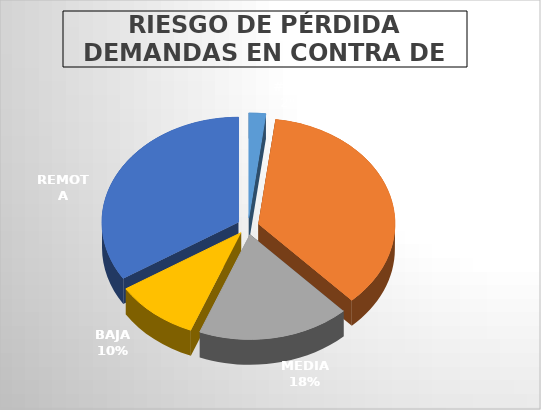
| Category | Series 0 |
|---|---|
| #N/A | 1 |
| ALTA | 18 |
| MEDIA | 9 |
| BAJA | 5 |
| REMOTA | 17 |